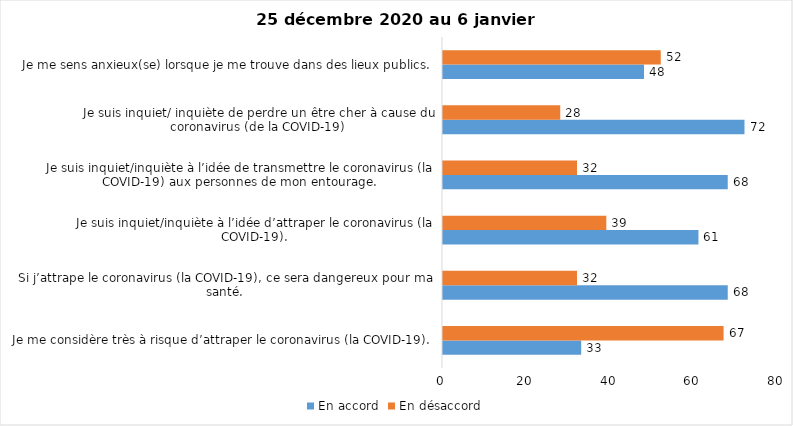
| Category | En accord | En désaccord |
|---|---|---|
| Je me considère très à risque d’attraper le coronavirus (la COVID-19). | 33 | 67 |
| Si j’attrape le coronavirus (la COVID-19), ce sera dangereux pour ma santé. | 68 | 32 |
| Je suis inquiet/inquiète à l’idée d’attraper le coronavirus (la COVID-19). | 61 | 39 |
| Je suis inquiet/inquiète à l’idée de transmettre le coronavirus (la COVID-19) aux personnes de mon entourage. | 68 | 32 |
| Je suis inquiet/ inquiète de perdre un être cher à cause du coronavirus (de la COVID-19) | 72 | 28 |
| Je me sens anxieux(se) lorsque je me trouve dans des lieux publics. | 48 | 52 |